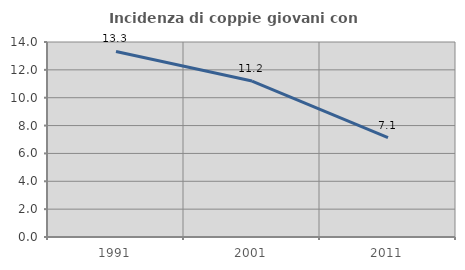
| Category | Incidenza di coppie giovani con figli |
|---|---|
| 1991.0 | 13.323 |
| 2001.0 | 11.196 |
| 2011.0 | 7.138 |